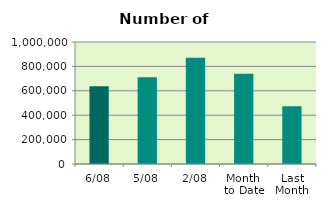
| Category | Series 0 |
|---|---|
| 6/08 | 637898 |
| 5/08 | 711628 |
| 2/08 | 871796 |
| Month 
to Date | 740531 |
| Last
Month | 472929.565 |